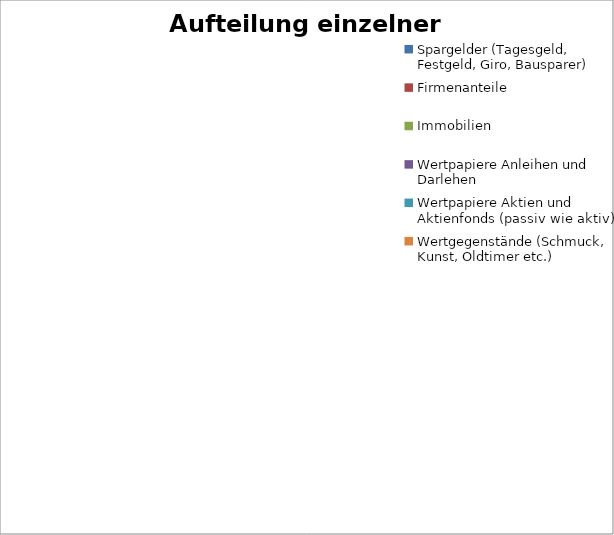
| Category | Series 0 |
|---|---|
| Spargelder (Tagesgeld, Festgeld, Giro, Bausparer) | 0 |
| Firmenanteile | 0 |
| Immobilien  | 0 |
| Wertpapiere Anleihen und Darlehen | 0 |
| Wertpapiere Aktien und Aktienfonds (passiv wie aktiv) | 0 |
| Wertgegenstände (Schmuck, Kunst, Oldtimer etc.) | 0 |
| Edelmetalle/Rohstoffe | 0 |